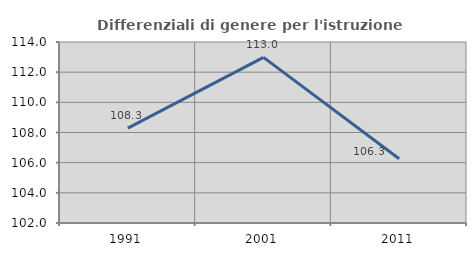
| Category | Differenziali di genere per l'istruzione superiore |
|---|---|
| 1991.0 | 108.293 |
| 2001.0 | 112.982 |
| 2011.0 | 106.259 |